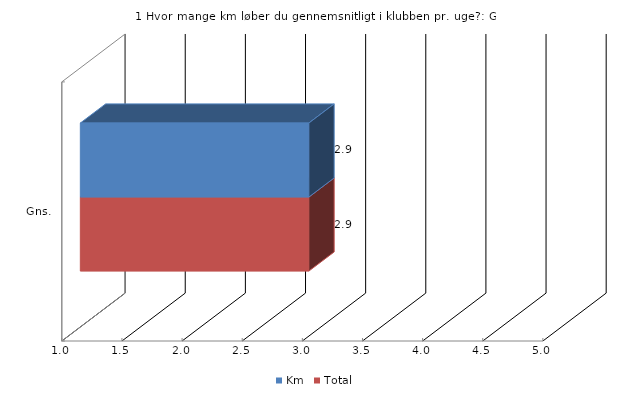
| Category | Km | Total |
|---|---|---|
| Gns. | 2.9 | 2.9 |